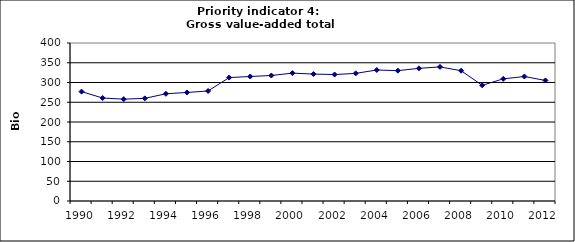
| Category | Gross value-added total industry, Bio Euro (EC95) |
|---|---|
| 1990 | 276.964 |
| 1991 | 260.727 |
| 1992 | 257.816 |
| 1993 | 259.847 |
| 1994 | 271.468 |
| 1995 | 274.791 |
| 1996 | 278.555 |
| 1997 | 312.445 |
| 1998 | 315.202 |
| 1999 | 317.757 |
| 2000 | 323.746 |
| 2001 | 321.357 |
| 2002 | 320.17 |
| 2003 | 323.095 |
| 2004 | 331.646 |
| 2005 | 330.022 |
| 2006 | 335.846 |
| 2007 | 339.517 |
| 2008 | 329.857 |
| 2009 | 292.919 |
| 2010 | 309.236 |
| 2011 | 315.181 |
| 2012 | 305.175 |